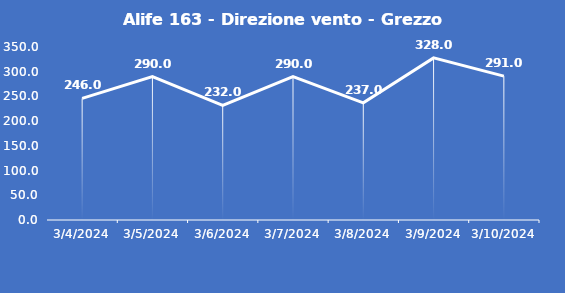
| Category | Alife 163 - Direzione vento - Grezzo (°N) |
|---|---|
| 3/4/24 | 246 |
| 3/5/24 | 290 |
| 3/6/24 | 232 |
| 3/7/24 | 290 |
| 3/8/24 | 237 |
| 3/9/24 | 328 |
| 3/10/24 | 291 |